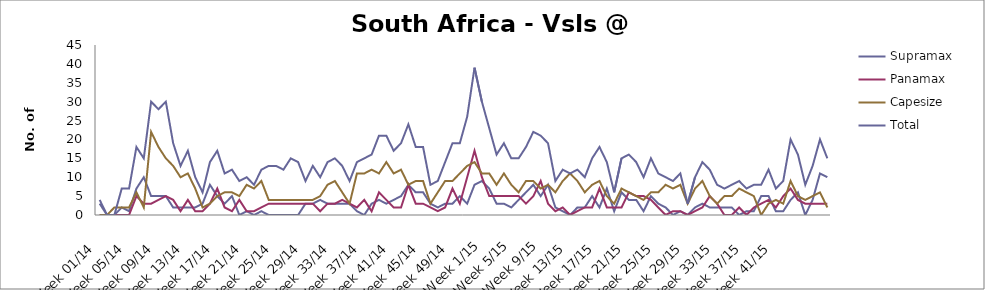
| Category | Supramax | Panamax | Capesize | Total |
|---|---|---|---|---|
| Week 01/14 | 3 | 0 | 0 | 4 |
| Week 02/14 | 0 | 0 | 0 | 0 |
| Week 03/14 | 0 | 0 | 2 | 0 |
| Week 04/14 | 2 | 0 | 2 | 7 |
| Week 05/14 | 1 | 0 | 2 | 7 |
| Week 06/14 | 7 | 5 | 6 | 18 |
| Week 07/14 | 10 | 3 | 2 | 15 |
| Week 08/14 | 5 | 3 | 22 | 30 |
| Week 09/14 | 5 | 4 | 18 | 28 |
| Week 10/14 | 5 | 5 | 15 | 30 |
| Week 11/14 | 2 | 4 | 13 | 19 |
| Week 12/14 | 2 | 1 | 10 | 13 |
| Week 13/14 | 2 | 4 | 11 | 17 |
| Week 14/14 | 2 | 1 | 7 | 10 |
| Week 15/14 | 3 | 1 | 2 | 6 |
| Week 16/14 | 8 | 3 | 3 | 14 |
| Week 17/14 | 5 | 7 | 5 | 17 |
| Week 18/14 | 3 | 2 | 6 | 11 |
| Week 19/14 | 5 | 1 | 6 | 12 |
| Week 20/14 | 0 | 4 | 5 | 9 |
| Week 21/14 | 1 | 1 | 8 | 10 |
| Week 22/14 | 0 | 1 | 7 | 8 |
| Week 23/14 | 1 | 2 | 9 | 12 |
| Week 24/14 | 0 | 3 | 4 | 13 |
| Week 25/14 | 0 | 3 | 4 | 13 |
| Week 26/14 | 0 | 3 | 4 | 12 |
| Week 27/14 | 0 | 3 | 4 | 15 |
| Week 28/14 | 0 | 3 | 4 | 14 |
| Week 29/14 | 3 | 3 | 4 | 9 |
| Week 30/14 | 3 | 3 | 4 | 13 |
| Week 31/14 | 4 | 1 | 5 | 10 |
| Week 32/14 | 3 | 3 | 8 | 14 |
| Week 33/14 | 3 | 3 | 9 | 15 |
| Week 34/14 | 3 | 4 | 6 | 13 |
| Week 35/14 | 3 | 3 | 3 | 9 |
| Week 36/14 | 1 | 2 | 11 | 14 |
| Week 37/14 | 0 | 4 | 11 | 15 |
| Week 38/14 | 3 | 1 | 12 | 16 |
| Week 39/14 | 4 | 6 | 11 | 21 |
| Week 40/14 | 3 | 4 | 14 | 21 |
| Week 41/14 | 4 | 2 | 11 | 17 |
| Week 42/14 | 5 | 2 | 12 | 19 |
| Week 43/14 | 8 | 8 | 8 | 24 |
| Week 44/14 | 6 | 3 | 9 | 18 |
| Week 45/14 | 6 | 3 | 9 | 18 |
| Week 46/14 | 3 | 2 | 3 | 8 |
| Week 47/14 | 2 | 1 | 6 | 9 |
| Week 48/14 | 3 | 2 | 9 | 14 |
| Week 49/14 | 3 | 7 | 9 | 19 |
| Week 50/14 | 5 | 3 | 11 | 19 |
| Week 51/14 | 3 | 10 | 13 | 26 |
| Week 52/14 | 8 | 17 | 14 | 39 |
| Week 1/15 | 9 | 10 | 11 | 30 |
| Week 2/15 | 7 | 5 | 11 | 23 |
| Week 3/15 | 3 | 5 | 8 | 16 |
| Week 4/15 | 3 | 5 | 11 | 19 |
| Week 5/15 | 2 | 5 | 8 | 15 |
| Week 6/15 | 4 | 5 | 6 | 15 |
| Week 7/15 | 6 | 3 | 9 | 18 |
| Week 8/15 | 8 | 5 | 9 | 22 |
| Week 9/15 | 5 | 9 | 7 | 21 |
| Week 10/15 | 8 | 3 | 8 | 19 |
| Week 11/15 | 2 | 1 | 6 | 9 |
| Week 12/15 | 1 | 2 | 9 | 12 |
| Week 13/15 | 0 | 0 | 11 | 11 |
| Week 14/15 | 2 | 1 | 9 | 12 |
| Week 15/15 | 2 | 2 | 6 | 10 |
| Week 16/15 | 5 | 2 | 8 | 15 |
| Week 17/15 | 2 | 7 | 9 | 18 |
| Week 18/15 | 7 | 2 | 5 | 14 |
| Week 19/15 | 1 | 2 | 3 | 6 |
| Week 20/15 | 6 | 2 | 7 | 15 |
| Week 21/15 | 4 | 6 | 6 | 16 |
| Week 22/15 | 4 | 5 | 5 | 14 |
| Week 23/15 | 1 | 5 | 4 | 10 |
| Week 24/15 | 5 | 4 | 6 | 15 |
| Week 25/15 | 3 | 2 | 6 | 11 |
| Week 26/15 | 2 | 0 | 8 | 10 |
| Week 27/15 | 0 | 1 | 7 | 9 |
| Week 28/15 | 1 | 1 | 8 | 11 |
| Week 29/15 | 0 | 0 | 3 | 3 |
| Week 30/15 | 2 | 1 | 7 | 10 |
| Week 31/15 | 3 | 2 | 9 | 14 |
| Week 32/15 | 2 | 5 | 5 | 12 |
| Week 33/15 | 2 | 3 | 3 | 8 |
| Week 34/15 | 2 | 0 | 5 | 7 |
| Week 35/15 | 2 | 0 | 5 | 8 |
| Week 36/15 | 0 | 2 | 7 | 9 |
| Week 37/15 | 1 | 0 | 6 | 7 |
| Week 38/15 | 1 | 2 | 5 | 8 |
| Week 39/15 | 5 | 3 | 0 | 8 |
| Week 40/15 | 5 | 4 | 3 | 12 |
| Week 41/15 | 1 | 2 | 4 | 7 |
| Week 42/15 | 1 | 5 | 3 | 9 |